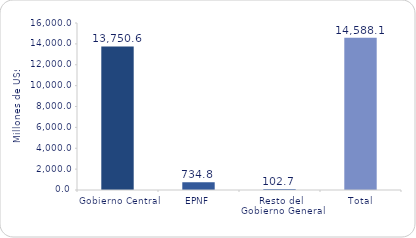
| Category | Series 1 |
|---|---|
| Gobierno Central | 13750.6 |
| EPNF | 734.8 |
| Resto del Gobierno General | 102.7 |
| Total | 14588.1 |